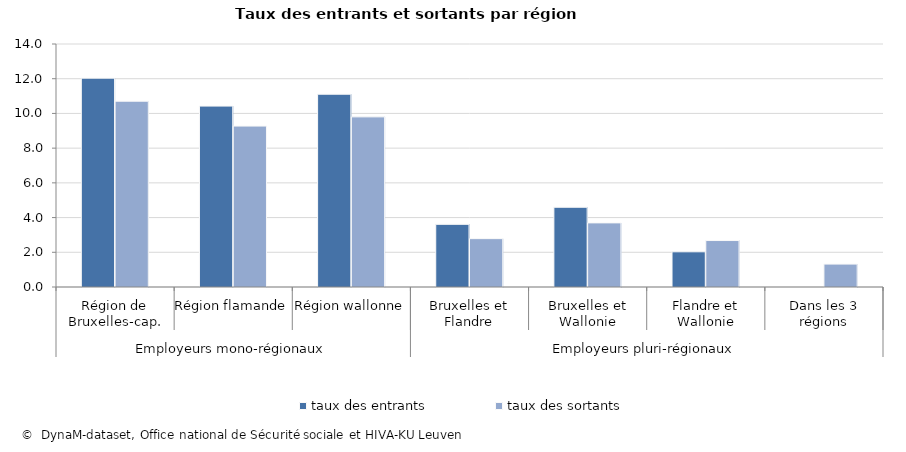
| Category | taux des entrants | taux des sortants |
|---|---|---|
| 0 | 12.031 | 10.704 |
| 1 | 10.423 | 9.272 |
| 2 | 11.106 | 9.801 |
| 3 | 3.61 | 2.787 |
| 4 | 4.595 | 3.694 |
| 5 | 2.028 | 2.676 |
| 6 | 0 | 1.319 |